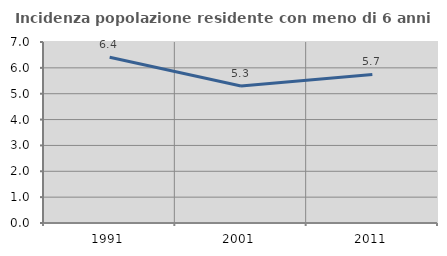
| Category | Incidenza popolazione residente con meno di 6 anni |
|---|---|
| 1991.0 | 6.408 |
| 2001.0 | 5.3 |
| 2011.0 | 5.747 |